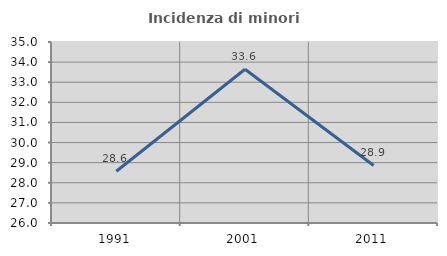
| Category | Incidenza di minori stranieri |
|---|---|
| 1991.0 | 28.571 |
| 2001.0 | 33.645 |
| 2011.0 | 28.862 |